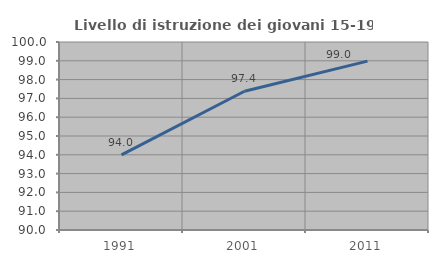
| Category | Livello di istruzione dei giovani 15-19 anni |
|---|---|
| 1991.0 | 94 |
| 2001.0 | 97.382 |
| 2011.0 | 98.983 |